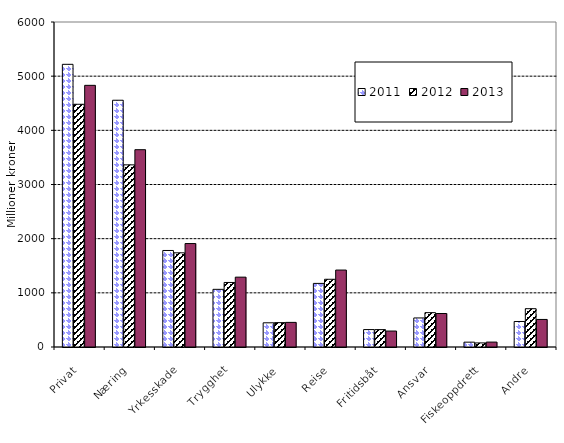
| Category | 2011 | 2012 | 2013 |
|---|---|---|---|
| Privat | 5218.576 | 4481.193 | 4830.734 |
| Næring | 4555.64 | 3362.859 | 3642.444 |
| Yrkesskade | 1782.115 | 1738.827 | 1909.625 |
| Trygghet | 1064.544 | 1191.406 | 1289.461 |
| Ulykke | 446.622 | 449.809 | 454.614 |
| Reise | 1174.205 | 1250.346 | 1420.393 |
| Fritidsbåt | 321.908 | 320.794 | 294.694 |
| Ansvar | 536.253 | 634.225 | 618.208 |
| Fiskeoppdrett | 89.156 | 75.303 | 90.619 |
| Andre | 470.948 | 707.262 | 508.644 |